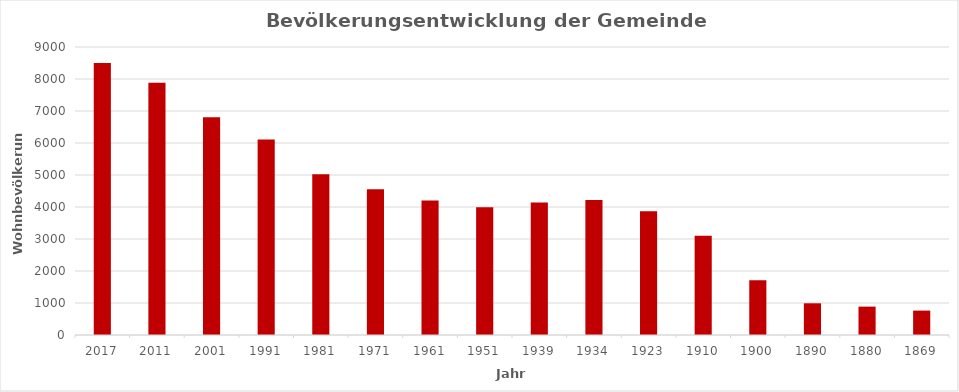
| Category | Series 5 |
|---|---|
| 2017 | 8503 |
| 2011 | 7882 |
| 2001 | 6808 |
| 1991 | 6111 |
| 1981 | 5021 |
| 1971 | 4558 |
| 1961 | 4207 |
| 1951 | 3996 |
| 1939 | 4144 |
| 1934 | 4219 |
| 1923 | 3865 |
| 1910 | 3101 |
| 1900 | 1709 |
| 1890 | 991 |
| 1880 | 887 |
| 1869 | 763 |